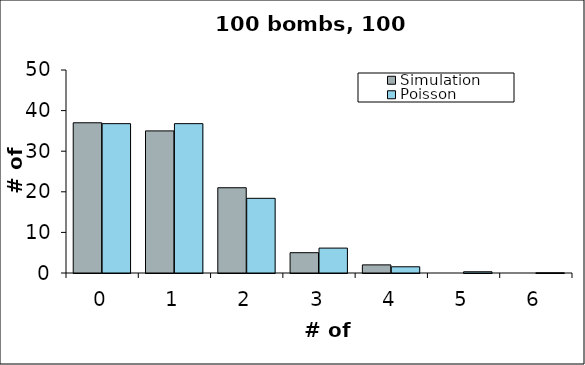
| Category | Simulation | Poisson |
|---|---|---|
| 0.0 | 37 | 36.788 |
| 1.0 | 35 | 36.788 |
| 2.0 | 21 | 18.394 |
| 3.0 | 5 | 6.131 |
| 4.0 | 2 | 1.533 |
| 5.0 | 0 | 0.307 |
| 6.0 | 0 | 0.051 |